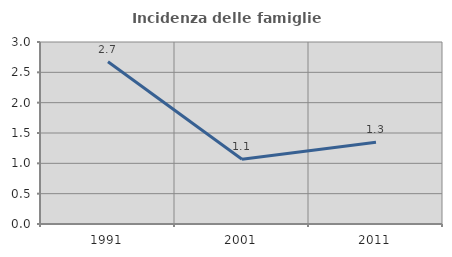
| Category | Incidenza delle famiglie numerose |
|---|---|
| 1991.0 | 2.675 |
| 2001.0 | 1.066 |
| 2011.0 | 1.346 |